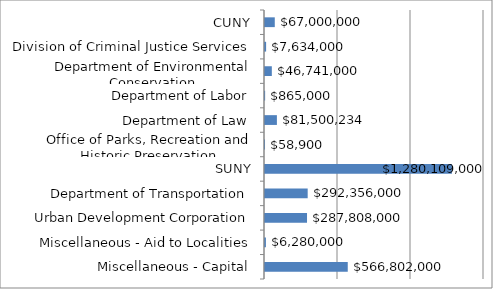
| Category | Series 0 |
|---|---|
| CUNY | 67000000 |
| Division of Criminal Justice Services | 7634000 |
| Department of Environmental Conservation | 46741000 |
| Department of Labor | 865000 |
| Department of Law | 81500234 |
| Office of Parks, Recreation and Historic Preservation | 58900 |
| SUNY | 1280109000 |
| Department of Transportation | 292356000 |
| Urban Development Corporation | 287808000 |
| Miscellaneous - Aid to Localities | 6280000 |
| Miscellaneous - Capital | 566802000 |